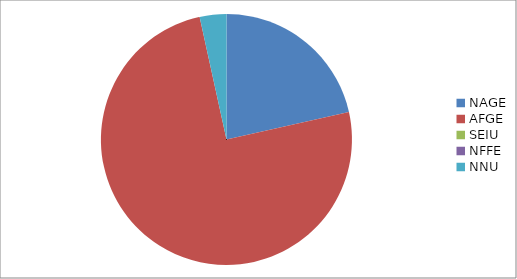
| Category | Series 0 |
|---|---|
| NAGE | 2453 |
| AFGE | 8574 |
| SEIU | 0 |
| NFFE | 0 |
| NNU | 392 |